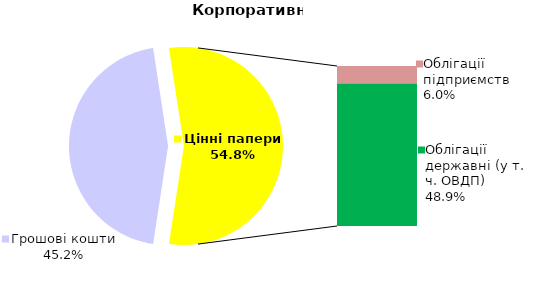
| Category | Корпоративні |
|---|---|
| Грошові кошти | 86822493.06 |
| Банківські метали | 0 |
| Нерухомість | 0 |
| Інші активи | 0 |
| Акції | 0 |
| Облігації підприємств | 11483015.861 |
| Муніципальні облігації | 0 |
| Облігації державні (у т. ч. ОВДП) | 93923107.523 |